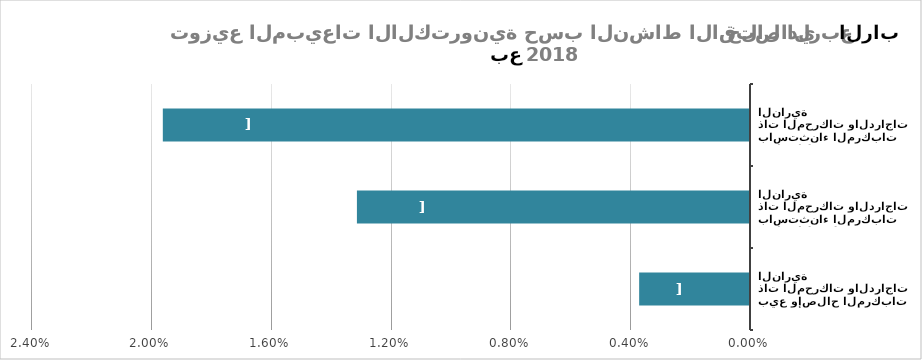
| Category | Series 0 |
|---|---|
| بيع وإصلاح المركبات ذات المحركات والدراجات النارية | 0.004 |
| تجارة الجملة، باستثناء المركبات ذات المحركات والدراجات النارية | 0.013 |
| تجارة التجزئة، باستثناء المركبات ذات المحركات والدراجات النارية | 0.02 |